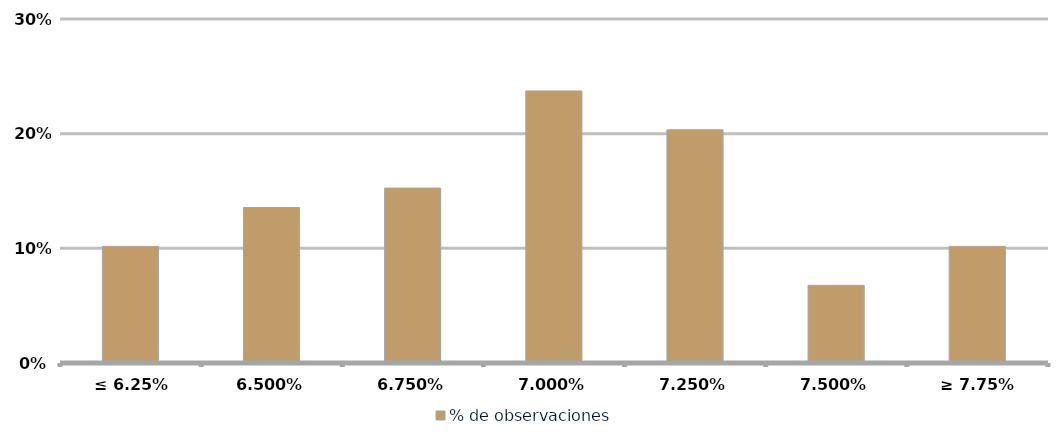
| Category | % de observaciones  |
|---|---|
| ≤ 6.25% | 0.102 |
| 6.50% | 0.136 |
| 6.75% | 0.153 |
| 7.00% | 0.237 |
| 7.25% | 0.203 |
| 7.50% | 0.068 |
| ≥ 7.75% | 0.102 |